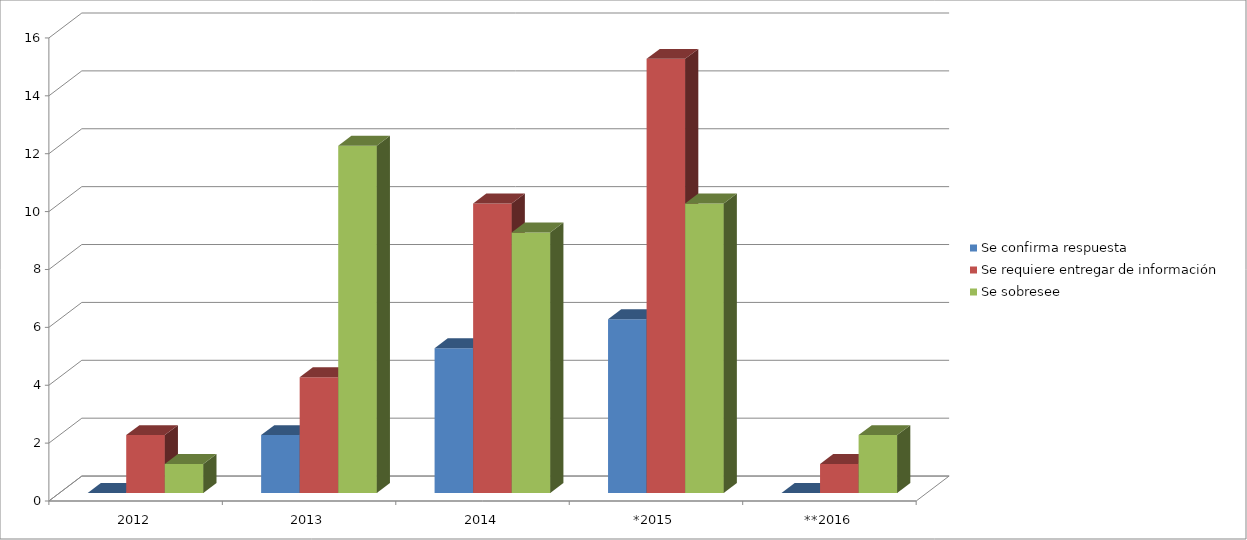
| Category | Se confirma respuesta | Se requiere entregar de información  | Se sobresee  |
|---|---|---|---|
| 2012 | 0 | 2 | 1 |
| 2013 | 2 | 4 | 12 |
| 2014 | 5 | 10 | 9 |
| *2015 | 6 | 15 | 10 |
| **2016 | 0 | 1 | 2 |